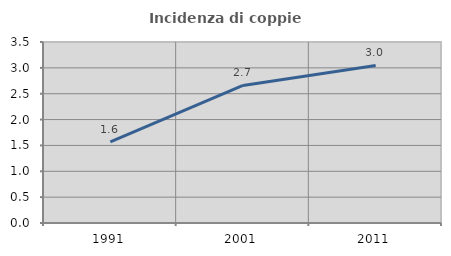
| Category | Incidenza di coppie miste |
|---|---|
| 1991.0 | 1.571 |
| 2001.0 | 2.66 |
| 2011.0 | 3.046 |